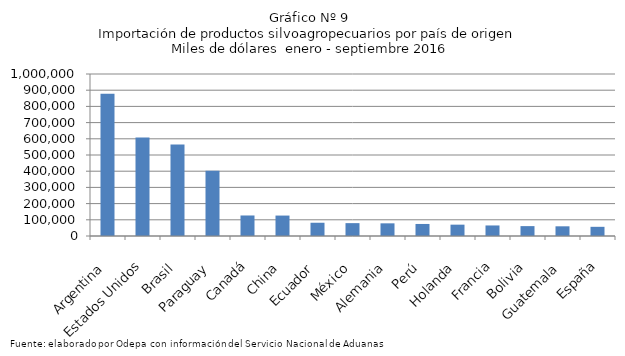
| Category | Series 0 |
|---|---|
| Argentina | 878735.283 |
| Estados Unidos | 607815.891 |
| Brasil | 565413.502 |
| Paraguay | 402600.623 |
| Canadá | 126652.516 |
| China | 126163.716 |
| Ecuador | 81827.575 |
| México | 79418.155 |
| Alemania | 78167.825 |
| Perú | 74326.029 |
| Holanda | 70006.28 |
| Francia | 65063.177 |
| Bolivia | 61014.339 |
| Guatemala | 59796.767 |
| España | 56664.645 |